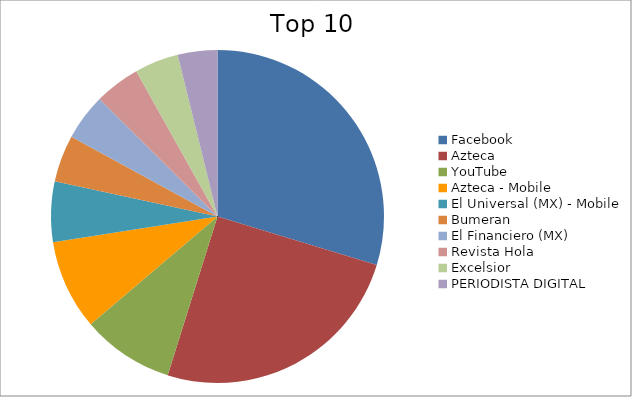
| Category | Series 0 |
|---|---|
| Facebook | 18.46 |
| Azteca | 15.61 |
| YouTube | 5.56 |
| Azteca - Mobile | 5.43 |
| El Universal (MX) - Mobile | 3.64 |
| Bumeran | 2.84 |
| El Financiero (MX) | 2.8 |
| Revista Hola | 2.75 |
| Excelsior | 2.65 |
| PERIODISTA DIGITAL | 2.39 |